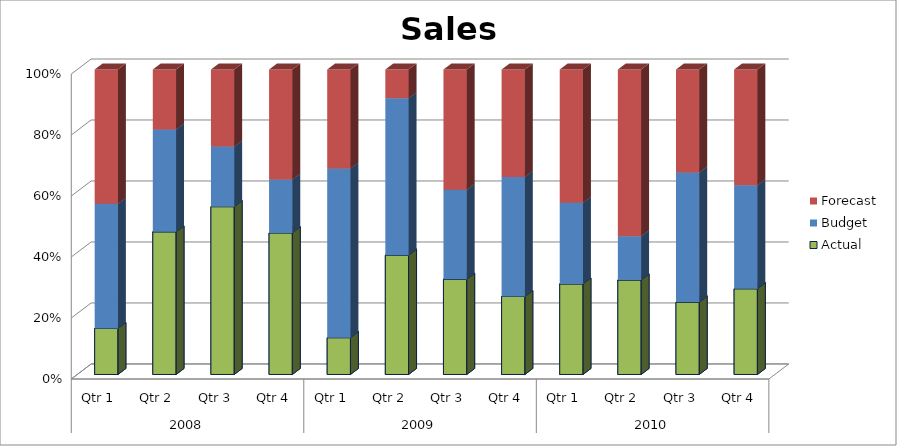
| Category | Actual | Budget | Forecast |
|---|---|---|---|
| 0 | 1090 | 2960 | 3180 |
| 1 | 1810 | 1300 | 760 |
| 2 | 3230 | 1160 | 1480 |
| 3 | 3050 | 1150 | 2370 |
| 4 | 520 | 2390 | 1400 |
| 5 | 2370 | 3120 | 570 |
| 6 | 2550 | 2400 | 3220 |
| 7 | 1460 | 2240 | 2010 |
| 8 | 2310 | 2070 | 3400 |
| 9 | 1450 | 670 | 2560 |
| 10 | 1730 | 3100 | 2460 |
| 11 | 1540 | 1860 | 2080 |